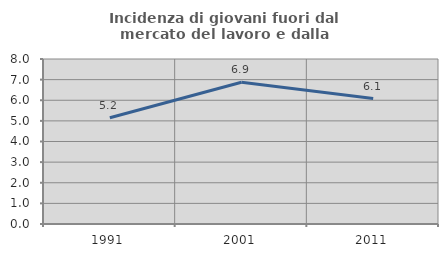
| Category | Incidenza di giovani fuori dal mercato del lavoro e dalla formazione  |
|---|---|
| 1991.0 | 5.153 |
| 2001.0 | 6.873 |
| 2011.0 | 6.081 |